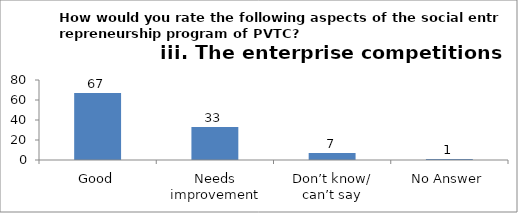
| Category | How would you rate the following aspects of the Social Entrepreneurship program of PVTC? iii. The enterprise competitions |
|---|---|
| Good | 67 |
| Needs improvement | 33 |
| Don’t know/ can’t say | 7 |
| No Answer | 1 |